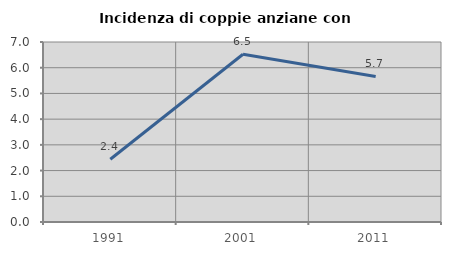
| Category | Incidenza di coppie anziane con figli |
|---|---|
| 1991.0 | 2.439 |
| 2001.0 | 6.522 |
| 2011.0 | 5.66 |